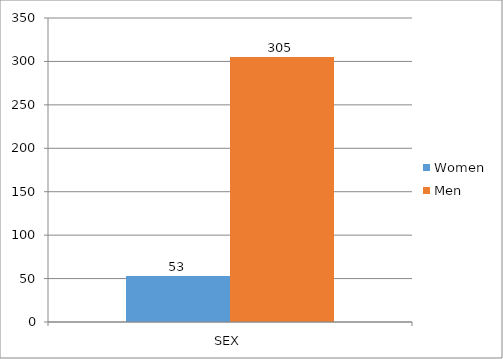
| Category | Women | Men |
|---|---|---|
| SEX | 53 | 305 |